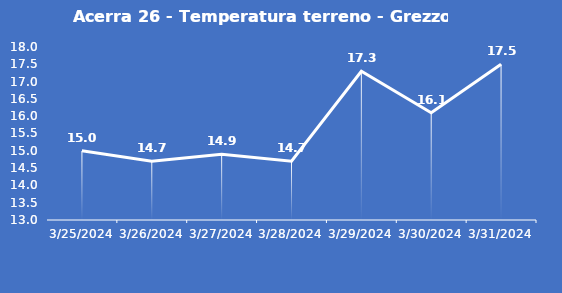
| Category | Acerra 26 - Temperatura terreno - Grezzo (°C) |
|---|---|
| 3/25/24 | 15 |
| 3/26/24 | 14.7 |
| 3/27/24 | 14.9 |
| 3/28/24 | 14.7 |
| 3/29/24 | 17.3 |
| 3/30/24 | 16.1 |
| 3/31/24 | 17.5 |